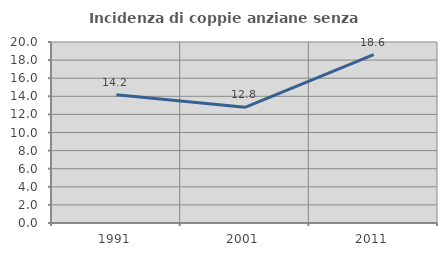
| Category | Incidenza di coppie anziane senza figli  |
|---|---|
| 1991.0 | 14.165 |
| 2001.0 | 12.78 |
| 2011.0 | 18.598 |